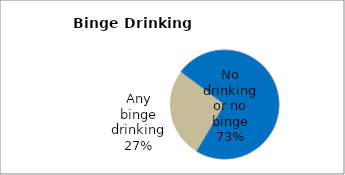
| Category | Series 0 |
|---|---|
| No drinking or no binge | 73.245 |
| Any binge drinking | 26.755 |